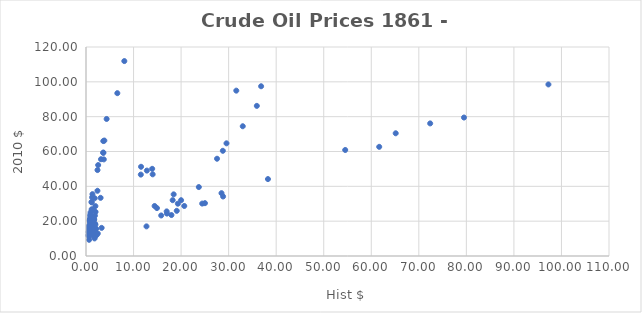
| Category | Real (2010) |
|---|---|
| 0.49 | 11.84 |
| 1.05 | 22.84 |
| 3.15 | 55.56 |
| 8.06 | 111.92 |
| 6.59 | 93.49 |
| 3.74 | 55.47 |
| 2.41 | 37.45 |
| 3.63 | 59.22 |
| 3.64 | 59.39 |
| 3.86 | 66.29 |
| 4.34 | 78.68 |
| 3.64 | 65.99 |
| 1.83 | 33.17 |
| 1.17 | 22.46 |
| 1.35 | 26.7 |
| 2.56 | 52.21 |
| 2.42 | 49.35 |
| 1.19 | 26.78 |
| 0.86 | 20.04 |
| 0.95 | 21.38 |
| 0.86 | 19.35 |
| 0.78 | 17.55 |
| 1.0 | 23.31 |
| 0.84 | 20.3 |
| 0.88 | 21.27 |
| 0.71 | 17.16 |
| 0.67 | 16.19 |
| 0.88 | 21.27 |
| 0.94 | 22.72 |
| 0.87 | 21.03 |
| 0.67 | 16.19 |
| 0.56 | 13.54 |
| 0.64 | 15.47 |
| 0.84 | 21.08 |
| 1.36 | 35.5 |
| 1.18 | 30.8 |
| 0.79 | 20.62 |
| 0.91 | 23.76 |
| 1.29 | 33.67 |
| 1.19 | 31.06 |
| 0.96 | 25.06 |
| 0.8 | 20.08 |
| 0.94 | 22.72 |
| 0.86 | 20.79 |
| 0.62 | 14.99 |
| 0.73 | 17.64 |
| 0.72 | 16.78 |
| 0.72 | 17.4 |
| 0.7 | 16.92 |
| 0.61 | 14.22 |
| 0.61 | 14.22 |
| 0.74 | 16.65 |
| 0.95 | 20.87 |
| 0.81 | 17.56 |
| 0.64 | 13.74 |
| 1.1 | 21.95 |
| 1.56 | 26.51 |
| 1.98 | 28.65 |
| 2.01 | 25.33 |
| 3.07 | 33.4 |
| 1.73 | 21.07 |
| 1.61 | 20.93 |
| 1.34 | 17.11 |
| 1.43 | 18.23 |
| 1.68 | 20.88 |
| 1.88 | 23.15 |
| 1.3 | 16.31 |
| 1.17 | 14.88 |
| 1.27 | 16.15 |
| 1.19 | 15.53 |
| 0.65 | 9.3 |
| 0.87 | 13.88 |
| 0.67 | 11.27 |
| 1.0 | 16.28 |
| 0.97 | 15.4 |
| 1.09 | 17.14 |
| 1.18 | 17.91 |
| 1.13 | 17.48 |
| 1.02 | 16 |
| 1.02 | 15.85 |
| 1.14 | 16.87 |
| 1.19 | 15.91 |
| 1.2 | 15.12 |
| 1.21 | 14.99 |
| 1.05 | 12.71 |
| 1.12 | 12.49 |
| 1.9 | 18.54 |
| 1.99 | 18.01 |
| 1.78 | 16.27 |
| 1.71 | 15.48 |
| 1.71 | 14.34 |
| 1.71 | 14.04 |
| 1.93 | 15.72 |
| 1.93 | 15.64 |
| 1.93 | 15.71 |
| 1.93 | 15.48 |
| 1.9 | 14.7 |
| 2.08 | 15.68 |
| 2.08 | 15.54 |
| 1.9 | 13.97 |
| 1.8 | 13.11 |
| 1.8 | 12.97 |
| 1.8 | 12.82 |
| 1.8 | 12.64 |
| 1.8 | 12.43 |
| 1.8 | 12.09 |
| 1.8 | 11.75 |
| 1.8 | 11.28 |
| 1.8 | 10.7 |
| 1.8 | 10.1 |
| 2.24 | 12.05 |
| 2.48 | 12.93 |
| 3.29 | 16.15 |
| 11.58 | 51.23 |
| 11.53 | 46.74 |
| 12.8 | 49.04 |
| 13.92 | 50.05 |
| 14.02 | 46.89 |
| 31.61 | 94.94 |
| 36.83 | 97.46 |
| 35.93 | 86.19 |
| 32.97 | 74.5 |
| 29.55 | 64.69 |
| 28.78 | 60.4 |
| 27.56 | 55.85 |
| 14.43 | 28.71 |
| 18.44 | 35.39 |
| 14.92 | 27.51 |
| 18.23 | 32.05 |
| 23.73 | 39.58 |
| 20.0 | 32.03 |
| 19.32 | 30.03 |
| 16.97 | 25.61 |
| 15.82 | 23.27 |
| 17.02 | 24.35 |
| 20.67 | 28.72 |
| 19.09 | 25.94 |
| 12.72 | 17.01 |
| 17.97 | 23.52 |
| 28.5 | 36.08 |
| 24.44 | 30.1 |
| 25.02 | 30.33 |
| 28.83 | 34.17 |
| 38.27 | 44.17 |
| 54.52 | 60.87 |
| 65.14 | 70.46 |
| 72.39 | 76.13 |
| 97.26 | 98.5 |
| 61.67 | 62.68 |
| 79.5 | 79.5 |